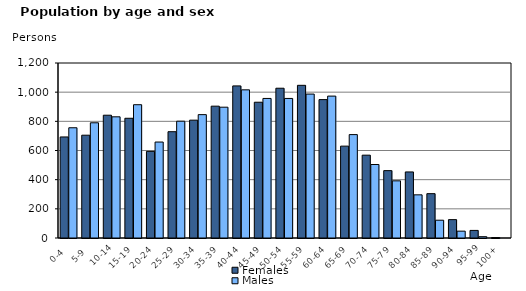
| Category | Females | Males |
|---|---|---|
|   0-4  | 693 | 756 |
|   5-9  | 705 | 790 |
| 10-14 | 842 | 831 |
| 15-19  | 821 | 914 |
| 20-24  | 594 | 658 |
| 25-29  | 729 | 801 |
| 30-34  | 808 | 846 |
| 35-39  | 904 | 897 |
| 40-44  | 1043 | 1016 |
| 45-49  | 931 | 957 |
| 50-54  | 1027 | 957 |
| 55-59  | 1047 | 987 |
| 60-64  | 949 | 973 |
| 65-69  | 630 | 709 |
| 70-74  | 568 | 504 |
| 75-79  | 462 | 392 |
| 80-84  | 453 | 296 |
| 85-89  | 304 | 122 |
| 90-94  | 126 | 47 |
| 95-99 | 52 | 9 |
| 100+ | 3 | 0 |